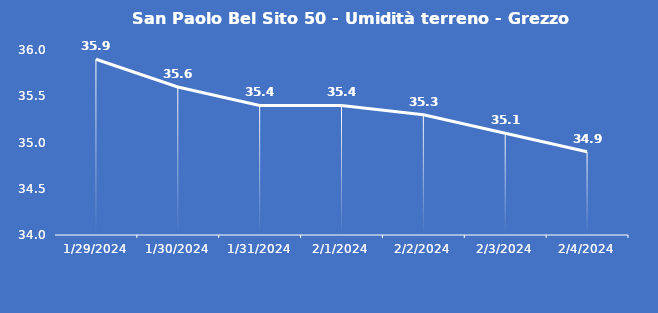
| Category | San Paolo Bel Sito 50 - Umidità terreno - Grezzo (%VWC) |
|---|---|
| 1/29/24 | 35.9 |
| 1/30/24 | 35.6 |
| 1/31/24 | 35.4 |
| 2/1/24 | 35.4 |
| 2/2/24 | 35.3 |
| 2/3/24 | 35.1 |
| 2/4/24 | 34.9 |